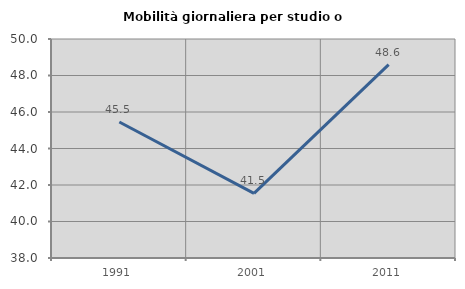
| Category | Mobilità giornaliera per studio o lavoro |
|---|---|
| 1991.0 | 45.455 |
| 2001.0 | 41.538 |
| 2011.0 | 48.598 |